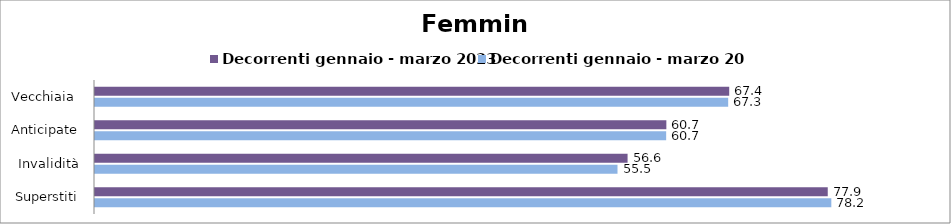
| Category | Decorrenti gennaio - marzo 2023 | Decorrenti gennaio - marzo 2024 |
|---|---|---|
| Vecchiaia  | 67.39 | 67.28 |
| Anticipate | 60.71 | 60.69 |
| Invalidità | 56.59 | 55.52 |
| Superstiti | 77.86 | 78.24 |